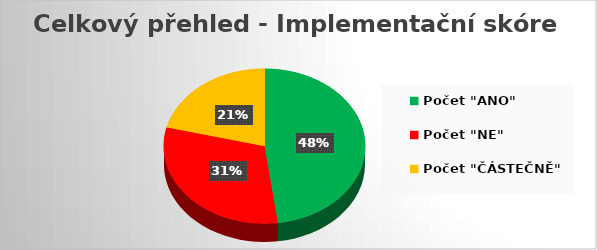
| Category | Series 0 |
|---|---|
| Počet "ANO" | 34 |
| Počet "NE" | 22 |
| Počet "ČÁSTEČNĚ" | 15 |